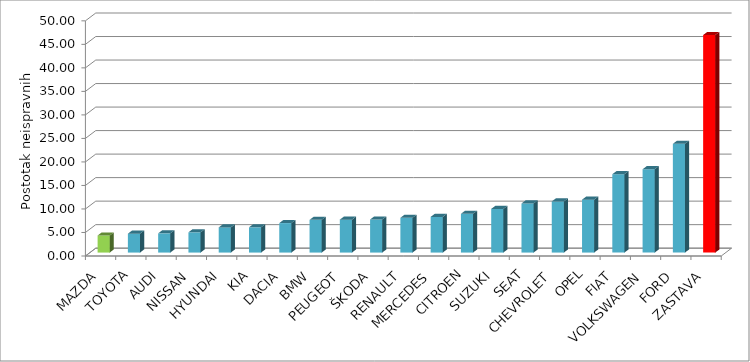
| Category | Series 4 |
|---|---|
| MAZDA | 3.626 |
| TOYOTA | 4.012 |
| AUDI | 4.083 |
| NISSAN | 4.301 |
| HYUNDAI | 5.348 |
| KIA | 5.366 |
| DACIA | 6.265 |
| BMW | 6.952 |
| PEUGEOT | 6.999 |
| ŠKODA | 7.027 |
| RENAULT | 7.395 |
| MERCEDES | 7.586 |
| CITROEN | 8.238 |
| SUZUKI | 9.278 |
| SEAT | 10.435 |
| CHEVROLET | 10.873 |
| OPEL | 11.248 |
| FIAT | 16.66 |
| VOLKSWAGEN | 17.716 |
| FORD | 23.119 |
| ZASTAVA | 46.251 |